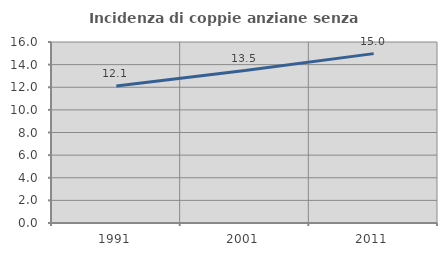
| Category | Incidenza di coppie anziane senza figli  |
|---|---|
| 1991.0 | 12.116 |
| 2001.0 | 13.476 |
| 2011.0 | 14.972 |